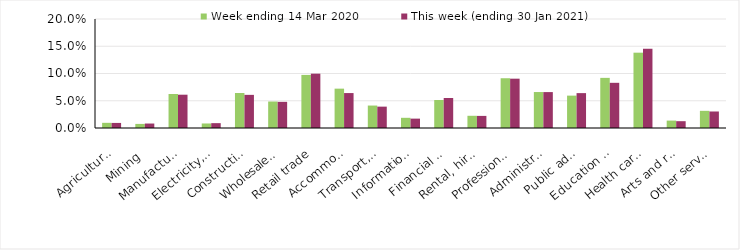
| Category | Week ending 14 Mar 2020 | This week (ending 30 Jan 2021) |
|---|---|---|
| Agriculture, forestry and fishing | 0.01 | 0.009 |
| Mining | 0.008 | 0.008 |
| Manufacturing | 0.062 | 0.061 |
| Electricity, gas, water and waste services | 0.008 | 0.009 |
| Construction | 0.064 | 0.061 |
| Wholesale trade | 0.049 | 0.048 |
| Retail trade | 0.097 | 0.1 |
| Accommodation and food services | 0.072 | 0.064 |
| Transport, postal and warehousing | 0.041 | 0.039 |
| Information media and telecommunications | 0.019 | 0.017 |
| Financial and insurance services | 0.051 | 0.055 |
| Rental, hiring and real estate services | 0.022 | 0.022 |
| Professional, scientific and technical services | 0.091 | 0.09 |
| Administrative and support services | 0.066 | 0.066 |
| Public administration and safety | 0.059 | 0.064 |
| Education and training | 0.092 | 0.083 |
| Health care and social assistance | 0.138 | 0.145 |
| Arts and recreation services | 0.014 | 0.012 |
| Other services | 0.032 | 0.03 |